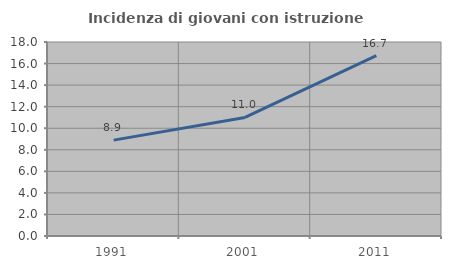
| Category | Incidenza di giovani con istruzione universitaria |
|---|---|
| 1991.0 | 8.895 |
| 2001.0 | 10.997 |
| 2011.0 | 16.735 |